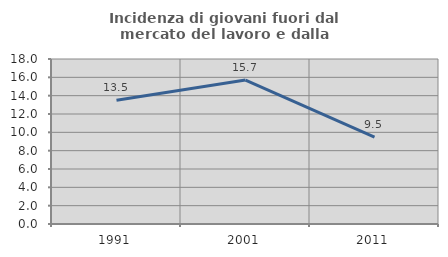
| Category | Incidenza di giovani fuori dal mercato del lavoro e dalla formazione  |
|---|---|
| 1991.0 | 13.503 |
| 2001.0 | 15.706 |
| 2011.0 | 9.487 |